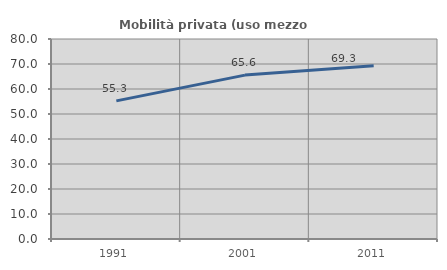
| Category | Mobilità privata (uso mezzo privato) |
|---|---|
| 1991.0 | 55.258 |
| 2001.0 | 65.552 |
| 2011.0 | 69.328 |